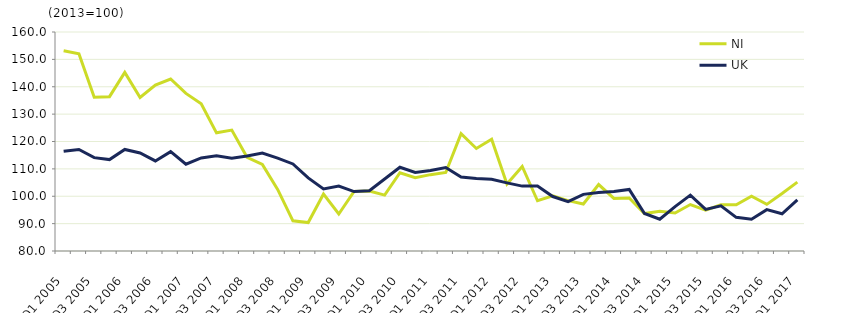
| Category | NI  | UK  |
|---|---|---|
| Q1 2005 | 153.179 | 116.4 |
| Q2 2005 | 152.027 | 117.1 |
| Q3 2005 | 136.198 | 114.1 |
| Q4 2005 | 136.375 | 113.4 |
| Q1 2006 | 145.233 | 117.1 |
| Q2 2006 | 136.099 | 115.8 |
| Q3 2006 | 140.636 | 112.9 |
| Q4 2006 | 142.82 | 116.3 |
| Q1 2007 | 137.567 | 111.7 |
| Q2 2007 | 133.793 | 114 |
| Q3 2007 | 123.168 | 114.8 |
| Q4 2007 | 124.152 | 113.9 |
| Q1 2008 | 114.22 | 114.7 |
| Q2 2008 | 111.616 | 115.8 |
| Q3 2008 | 102.513 | 113.9 |
| Q4 2008 | 91.022 | 111.8 |
| Q1 2009 | 90.383 | 106.7 |
| Q2 2009 | 100.782 | 102.7 |
| Q3 2009 | 93.506 | 103.7 |
| Q4 2009 | 101.783 | 101.7 |
| Q1 2010 | 101.886 | 102 |
| Q2 2010 | 100.424 | 106.3 |
| Q3 2010 | 108.579 | 110.6 |
| Q4 2010 | 106.789 | 108.7 |
| Q1 2011 | 107.89 | 109.4 |
| Q2 2011 | 108.679 | 110.5 |
| Q3 2011 | 122.873 | 107 |
| Q4 2011 | 117.456 | 106.5 |
| Q1 2012 | 120.843 | 106.2 |
| Q2 2012 | 104.445 | 104.9 |
| Q3 2012 | 110.899 | 103.7 |
| Q4 2012 | 98.356 | 103.7 |
| Q1 2013 | 100.159 | 99.9 |
| Q2 2013 | 98.403 | 98 |
| Q3 2013 | 97.157 | 100.7 |
| Q4 2013 | 104.28 | 101.4 |
| Q1 2014 | 99.215 | 101.7 |
| Q2 2014 | 99.372 | 102.5 |
| Q3 2014 | 93.674 | 93.7 |
| Q4 2014 | 94.507 | 91.6 |
| Q1 2015 | 93.887 | 96.2 |
| Q2 2015 | 96.971 | 100.4 |
| Q3 2015 | 94.937 | 95.2 |
| Q4 2015 | 96.879 | 96.5 |
| Q1 2016 | 96.896 | 92.3 |
| Q2 2016 | 99.987 | 91.6 |
| Q3 2016 | 97.038 | 95.1 |
| Q4 2016 | 100.983 | 93.6 |
| Q1 2017 | 105.154 | 98.7 |